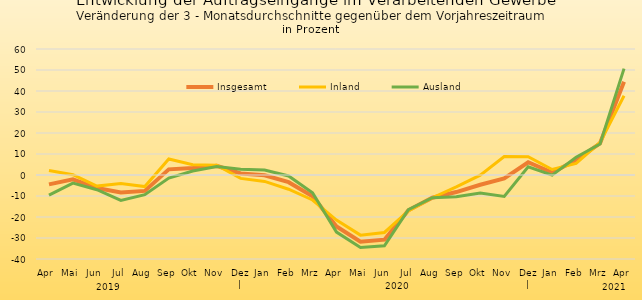
| Category | Insgesamt | Inland | Ausland |
|---|---|---|---|
| Apr | -4.467 | 2.104 | -9.582 |
| Mai | -2.041 | 0.129 | -3.875 |
| Jun | -6.225 | -5.286 | -7.015 |
| Jul | -8.369 | -4.006 | -12.098 |
| Aug | -7.574 | -5.52 | -9.395 |
| Sep | 2.678 | 7.601 | -1.471 |
| Okt | 3.299 | 4.935 | 1.927 |
| Nov | 4.338 | 4.689 | 4.053 |
| Dez | | 0.724 | -1.607 | 2.714 |
| Jan | -0.139 | -3.047 | 2.376 |
| Feb | -3.427 | -6.766 | -0.441 |
| Mrz | -10.103 | -11.896 | -8.472 |
| Apr | -24.521 | -21.477 | -27.197 |
| Mai | -31.782 | -28.641 | -34.547 |
| Jun | -30.782 | -27.367 | -33.707 |
| Jul | -16.804 | -17.127 | -16.502 |
| Aug | -10.8 | -10.821 | -10.78 |
| Sep | -8.12 | -5.677 | -10.367 |
| Okt | -4.636 | -0.065 | -8.581 |
| Nov | -1.67 | 8.789 | -10.206 |
| Dez | | 6.054 | 8.73 | 3.865 |
| Jan | 1.121 | 2.615 | -0.087 |
| Feb | 7.122 | 5.507 | 8.458 |
| Mrz | 15.104 | 15.504 | 14.761 |
| Apr | 44.374 | 37.71 | 50.641 |